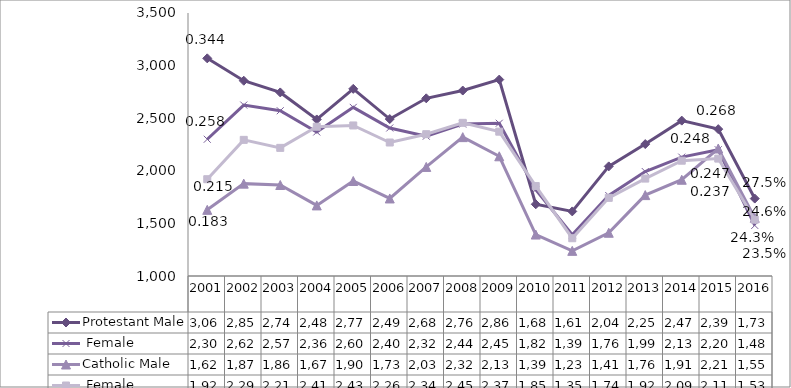
| Category | Protestant | Catholic |
|---|---|---|
| 2001.0 | 2300 | 1920 |
| 2002.0 | 2625 | 2294 |
| 2003.0 | 2571 | 2218 |
| 2004.0 | 2369 | 2419 |
| 2005.0 | 2603 | 2431 |
| 2006.0 | 2407 | 2269 |
| 2007.0 | 2329 | 2348 |
| 2008.0 | 2444 | 2456 |
| 2009.0 | 2452 | 2372 |
| 2010.0 | 1821 | 1855 |
| 2011.0 | 1392 | 1359 |
| 2012.0 | 1765 | 1743 |
| 2013.0 | 1993 | 1926 |
| 2014.0 | 2130 | 2096 |
| 2015.0 | 2200 | 2116 |
| 2016.0 | 1481 | 1535 |